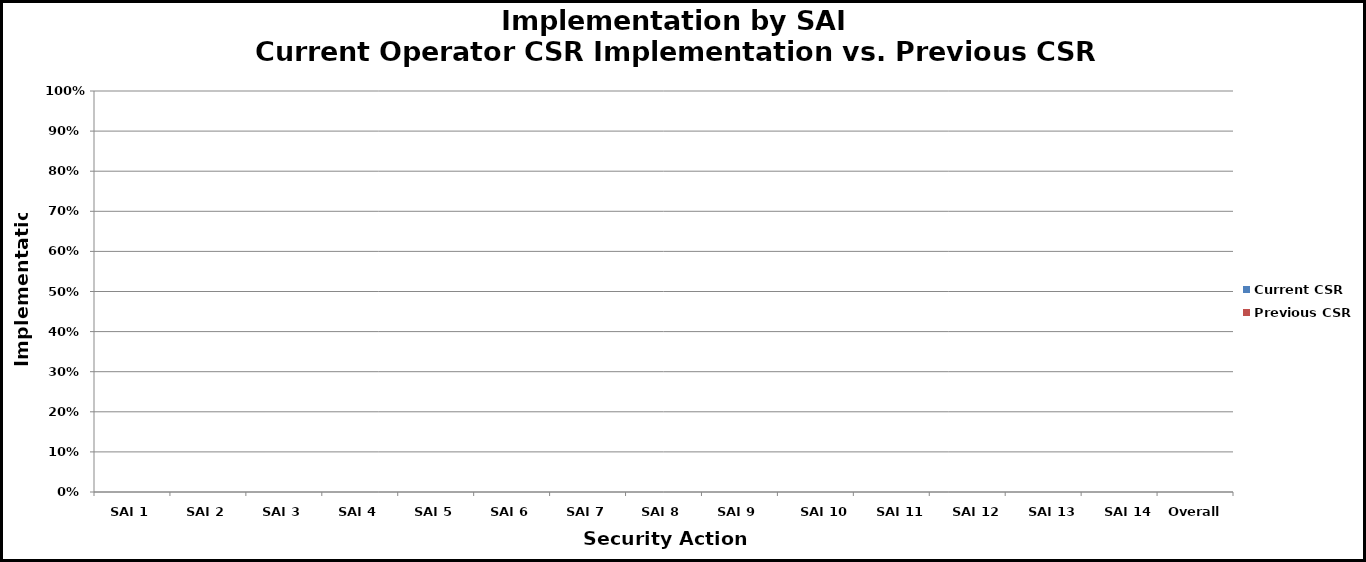
| Category | Current CSR | Previous CSR |
|---|---|---|
| SAI 1 | 0 | 0 |
| SAI 2 | 0 | 0 |
| SAI 3 | 0 | 0 |
| SAI 4 | 0 | 0 |
| SAI 5 | 0 | 0 |
| SAI 6 | 0 | 0 |
| SAI 7 | 0 | 0 |
| SAI 8 | 0 | 0 |
| SAI 9 | 0 | 0 |
| SAI 10 | 0 | 0 |
| SAI 11 | 0 | 0 |
| SAI 12 | 0 | 0 |
| SAI 13 | 0 | 0 |
| SAI 14 | 0 | 0 |
| Overall | 0 | 0 |